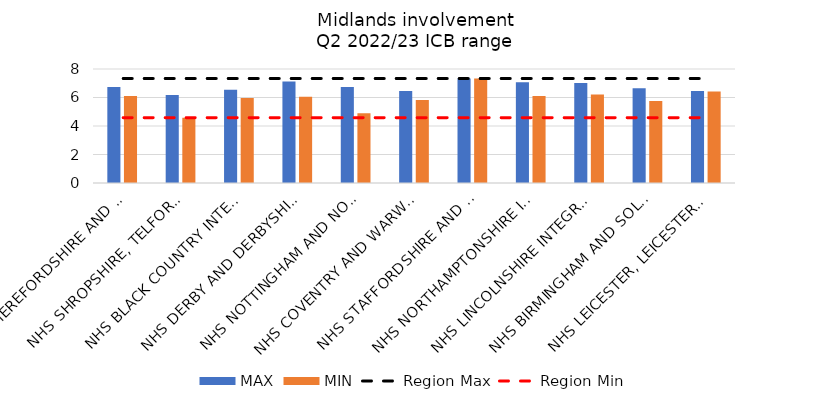
| Category | MAX | MIN |
|---|---|---|
| NHS HEREFORDSHIRE AND WORCESTERSHIRE INTEGRATED CARE BOARD | 6.731 | 6.107 |
| NHS SHROPSHIRE, TELFORD AND WREKIN INTEGRATED CARE BOARD | 6.176 | 4.583 |
| NHS BLACK COUNTRY INTEGRATED CARE BOARD | 6.536 | 5.97 |
| NHS DERBY AND DERBYSHIRE INTEGRATED CARE BOARD | 7.12 | 6.047 |
| NHS NOTTINGHAM AND NOTTINGHAMSHIRE INTEGRATED CARE BOARD | 6.745 | 4.897 |
| NHS COVENTRY AND WARWICKSHIRE INTEGRATED CARE BOARD | 6.453 | 5.823 |
| NHS STAFFORDSHIRE AND STOKE-ON-TRENT INTEGRATED CARE BOARD | 7.334 | 7.334 |
| NHS NORTHAMPTONSHIRE INTEGRATED CARE BOARD | 7.073 | 6.108 |
| NHS LINCOLNSHIRE INTEGRATED CARE BOARD | 7.025 | 6.207 |
| NHS BIRMINGHAM AND SOLIHULL INTEGRATED CARE BOARD | 6.64 | 5.753 |
| NHS LEICESTER, LEICESTERSHIRE AND RUTLAND INTEGRATED CARE BOARD | 6.463 | 6.416 |